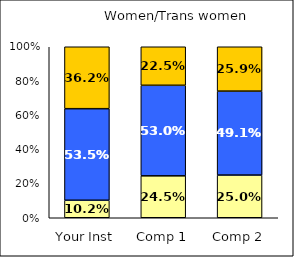
| Category | Low Job Satisfaction: Compensation | Average Job Satisfaction: Compensation | High Job Satisfaction: Compensation |
|---|---|---|---|
| Your Inst | 0.102 | 0.535 | 0.362 |
| Comp 1 | 0.245 | 0.53 | 0.225 |
| Comp 2 | 0.25 | 0.491 | 0.259 |